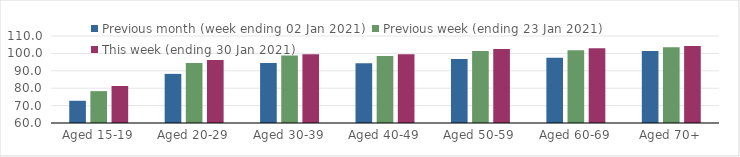
| Category | Previous month (week ending 02 Jan 2021) | Previous week (ending 23 Jan 2021) | This week (ending 30 Jan 2021) |
|---|---|---|---|
| Aged 15-19 | 72.78 | 78.31 | 81.27 |
| Aged 20-29 | 88.24 | 94.54 | 96.2 |
| Aged 30-39 | 94.49 | 98.8 | 99.56 |
| Aged 40-49 | 94.41 | 98.45 | 99.49 |
| Aged 50-59 | 96.85 | 101.34 | 102.58 |
| Aged 60-69 | 97.52 | 101.86 | 102.93 |
| Aged 70+ | 101.32 | 103.59 | 104.25 |